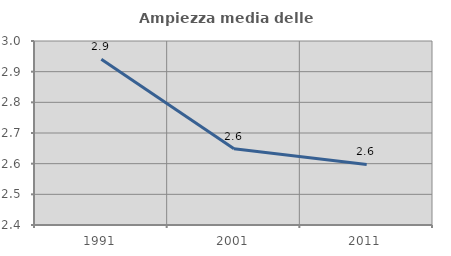
| Category | Ampiezza media delle famiglie |
|---|---|
| 1991.0 | 2.941 |
| 2001.0 | 2.649 |
| 2011.0 | 2.597 |